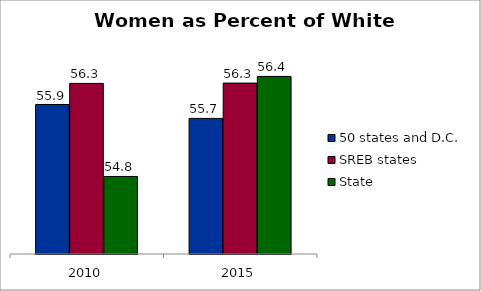
| Category | 50 states and D.C. | SREB states | State |
|---|---|---|---|
| 2010.0 | 55.945 | 56.29 | 54.768 |
| 2015.0 | 55.718 | 56.295 | 56.404 |